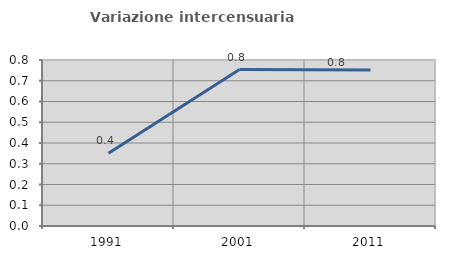
| Category | Variazione intercensuaria annua |
|---|---|
| 1991.0 | 0.351 |
| 2001.0 | 0.754 |
| 2011.0 | 0.752 |